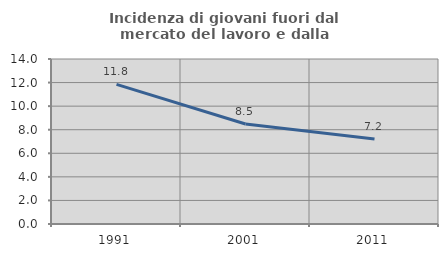
| Category | Incidenza di giovani fuori dal mercato del lavoro e dalla formazione  |
|---|---|
| 1991.0 | 11.85 |
| 2001.0 | 8.482 |
| 2011.0 | 7.216 |